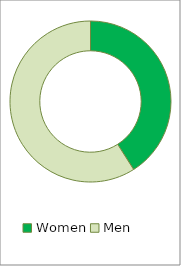
| Category | Series 0 |
|---|---|
| Women | 0.41 |
| Men | 0.59 |